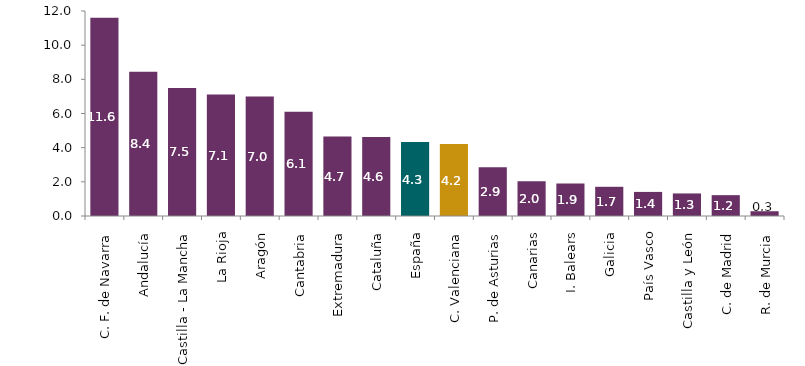
| Category | Índice de precios en alojamientos de turismo rural |
|---|---|
| C. F. de Navarra | 11.61 |
| Andalucía | 8.44 |
| Castilla - La Mancha | 7.5 |
| La Rioja | 7.11 |
| Aragón | 7 |
| Cantabria | 6.1 |
| Extremadura | 4.66 |
| Cataluña | 4.63 |
| España | 4.33 |
| C. Valenciana | 4.21 |
| P. de Asturias | 2.85 |
| Canarias | 2.04 |
| I. Balears | 1.9 |
| Galicia | 1.71 |
| País Vasco | 1.41 |
| Castilla y León | 1.32 |
| C. de Madrid | 1.22 |
| R. de Murcia | 0.28 |